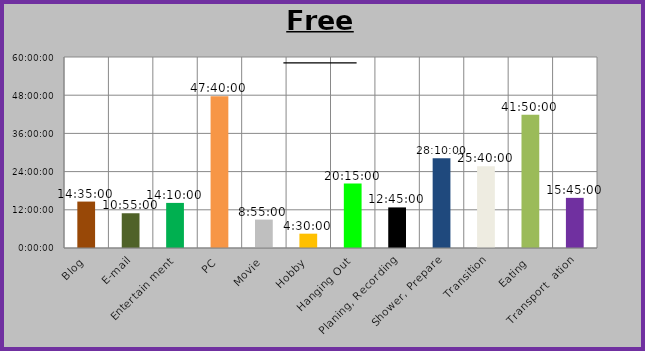
| Category | Free time |
|---|---|
| Blog | 0.608 |
| E-mail | 0.455 |
| Entertain ment | 0.59 |
| PC | 1900-01-01 23:40:00 |
| Movie | 0.372 |
| Hobby | 0.188 |
| Hanging Out | 0.844 |
| Planing, Recording | 0.531 |
| Shower, Prepare | 1900-01-01 04:10:00 |
| Transition | 1900-01-01 01:40:00 |
| Eating | 1900-01-01 17:50:00 |
| Transport  ation | 0.656 |